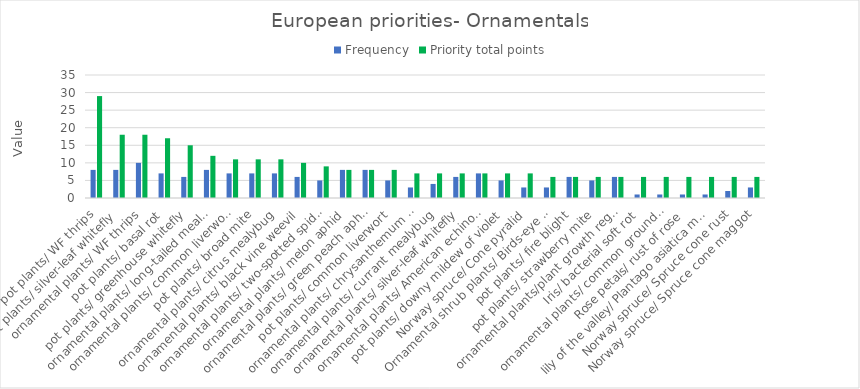
| Category | Frequency | Priority total points |
|---|---|---|
| pot plants/ WF thrips | 8 | 29 |
| pot plants/ silver-leaf whitefly | 8 | 18 |
| ornamental plants/ WF thrips | 10 | 18 |
| pot plants/ basal rot | 7 | 17 |
| pot plants/ greenhouse whitefly | 6 | 15 |
| ornamental plants/ long-tailed mealybug | 8 | 12 |
| ornamental plants/ common liverwort | 7 | 11 |
| pot plants/ broad mite | 7 | 11 |
| ornamental plants/ citrus mealybug | 7 | 11 |
| ornamental plants/ black vine weevil | 6 | 10 |
| ornamental plants/ two-spotted spider mite | 5 | 9 |
| ornamental plants/ melon aphid | 8 | 8 |
| ornamental plants/ green peach aphid | 8 | 8 |
| pot plants/ common liverwort | 5 | 8 |
| ornamental plants/ chrysanthemum leaf nematode | 3 | 7 |
| ornamental plants/ currant mealybug | 4 | 7 |
| ornamental plants/ silver-leaf whitefly | 6 | 7 |
| ornamental plants/ American echinothrips | 7 | 7 |
| pot plants/ downy mildew of violet | 5 | 7 |
| Norway spruce/ Cone pyralid | 3 | 7 |
| Ornamental shrub plants/ Birds-eye pearlwort | 3 | 6 |
| pot plants/ fire blight | 6 | 6 |
| pot plants/ strawberry mite | 5 | 6 |
| ornamental plants/plant growth regulator  | 6 | 6 |
| Iris/ bacterial soft rot | 1 | 6 |
| ornamental plants/ common groundsel | 1 | 6 |
| Rose petals/ rust of rose | 1 | 6 |
| lily of the valley/ Plantago asiatica mosaic virus | 1 | 6 |
| Norway spruce/ Spruce cone rust | 2 | 6 |
| Norway spruce/ Spruce cone maggot | 3 | 6 |